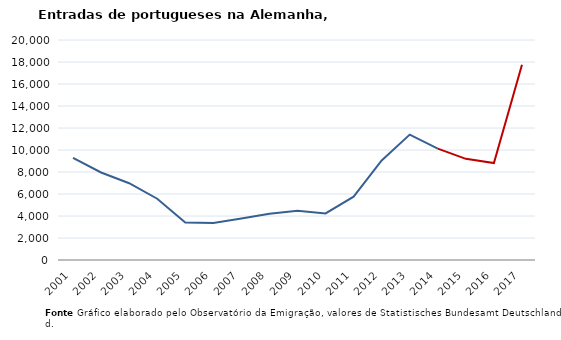
| Category | Entradas |
|---|---|
| 2001.0 | 9287 |
| 2002.0 | 7955 |
| 2003.0 | 6981 |
| 2004.0 | 5570 |
| 2005.0 | 3418 |
| 2006.0 | 3371 |
| 2007.0 | 3766 |
| 2008.0 | 4214 |
| 2009.0 | 4468 |
| 2010.0 | 4238 |
| 2011.0 | 5752 |
| 2012.0 | 9054 |
| 2013.0 | 11401 |
| 2014.0 | 10121 |
| 2015.0 | 9195 |
| 2016.0 | 8810 |
| 2017.0 | 17750 |